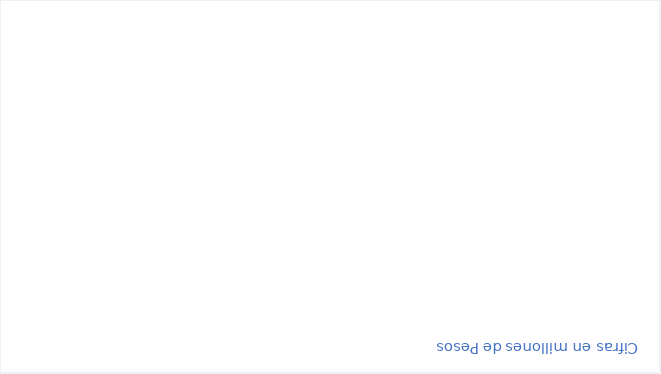
| Category | RESERVAS CONSTITUIDAS
 | CANCELACIONES RESERVAS PRESUPUESTALES
  | PAGOS
ACUMULADOS
 |
|---|---|---|---|
| Total | 55446.915 | 0 | 20523.332 |